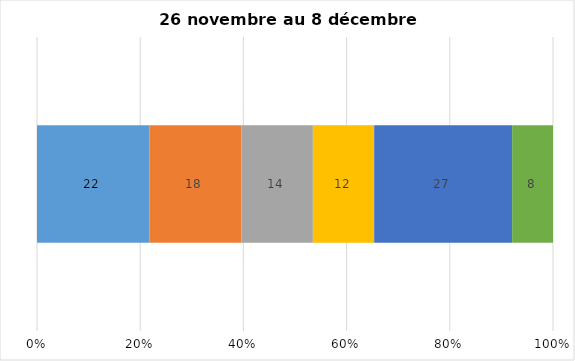
| Category | Plusieurs fois par jour | Une fois par jour | Quelques fois par semaine   | Une fois par semaine ou moins   |  Jamais   |  Je n’utilise pas les médias sociaux |
|---|---|---|---|---|---|---|
| 0 | 22 | 18 | 14 | 12 | 27 | 8 |